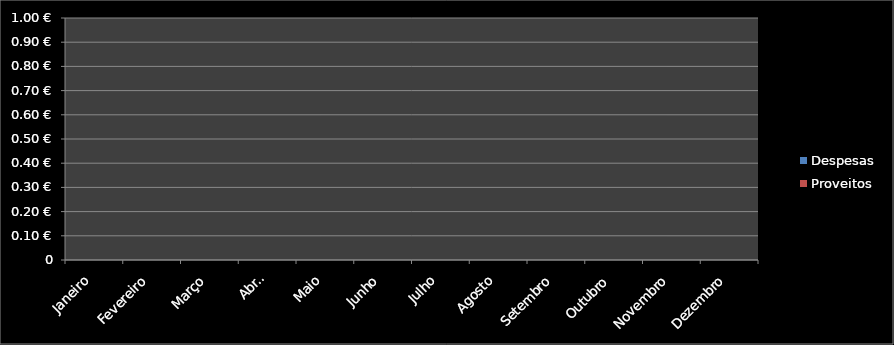
| Category | Despesas | Proveitos |
|---|---|---|
| Janeiro | 0 | 0 |
| Fevereiro | 0 | 0 |
| Março | 0 | 0 |
| Abril | 0 | 0 |
| Maio | 0 | 0 |
| Junho | 0 | 0 |
| Julho | 0 | 0 |
| Agosto | 0 | 0 |
| Setembro | 0 | 0 |
| Outubro | 0 | 0 |
| Novembro | 0 | 0 |
| Dezembro | 0 | 0 |